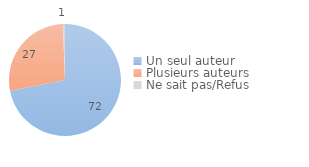
| Category | Series 0 |
|---|---|
| Un seul auteur | 71.955 |
| Plusieurs auteurs | 27.451 |
| Ne sait pas/Refus | 0.594 |